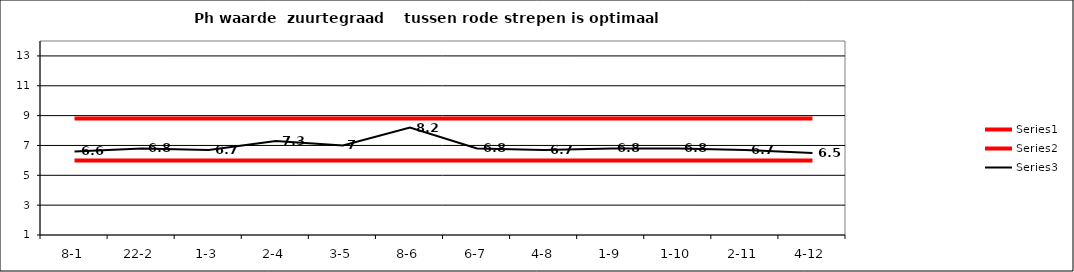
| Category | Series 0 | Series 1 | Series 2 |
|---|---|---|---|
| 8-1 | 8.8 | 6 | 6.6 |
| 22-2 | 8.8 | 6 | 6.8 |
| 1-3 | 8.8 | 6 | 6.7 |
| 2-4 | 8.8 | 6 | 7.3 |
| 3-5 | 8.8 | 6 | 7 |
| 8-6 | 8.8 | 6 | 8.2 |
| 6-7 | 8.8 | 6 | 6.8 |
| 4-8 | 8.8 | 6 | 6.7 |
| 1-9 | 8.8 | 6 | 6.8 |
| 1-10 | 8.8 | 6 | 6.8 |
| 2-11 | 8.8 | 6 | 6.7 |
| 4-12 | 8.8 | 6 | 6.5 |